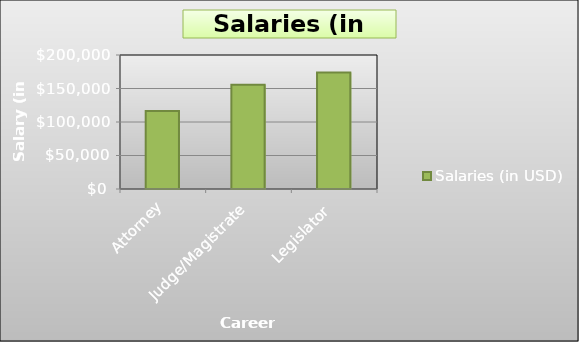
| Category | Salaries (in USD) |
|---|---|
| Attorney | 116550 |
| Judge/Magistrate | 155756 |
| Legislator | 174000 |